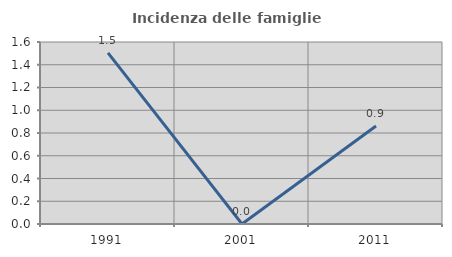
| Category | Incidenza delle famiglie numerose |
|---|---|
| 1991.0 | 1.504 |
| 2001.0 | 0 |
| 2011.0 | 0.862 |